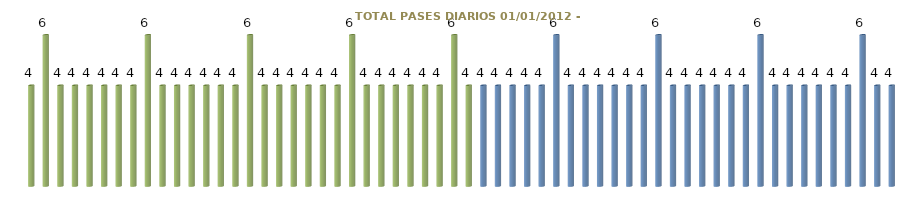
| Category | TOTAL PASES |
|---|---|
| 0 | 4 |
| 1 | 6 |
| 2 | 4 |
| 3 | 4 |
| 4 | 4 |
| 5 | 4 |
| 6 | 4 |
| 7 | 4 |
| 8 | 6 |
| 9 | 4 |
| 10 | 4 |
| 11 | 4 |
| 12 | 4 |
| 13 | 4 |
| 14 | 4 |
| 15 | 6 |
| 16 | 4 |
| 17 | 4 |
| 18 | 4 |
| 19 | 4 |
| 20 | 4 |
| 21 | 4 |
| 22 | 6 |
| 23 | 4 |
| 24 | 4 |
| 25 | 4 |
| 26 | 4 |
| 27 | 4 |
| 28 | 4 |
| 29 | 6 |
| 30 | 4 |
| 31 | 4 |
| 32 | 4 |
| 33 | 4 |
| 34 | 4 |
| 35 | 4 |
| 36 | 6 |
| 37 | 4 |
| 38 | 4 |
| 39 | 4 |
| 40 | 4 |
| 41 | 4 |
| 42 | 4 |
| 43 | 6 |
| 44 | 4 |
| 45 | 4 |
| 46 | 4 |
| 47 | 4 |
| 48 | 4 |
| 49 | 4 |
| 50 | 6 |
| 51 | 4 |
| 52 | 4 |
| 53 | 4 |
| 54 | 4 |
| 55 | 4 |
| 56 | 4 |
| 57 | 6 |
| 58 | 4 |
| 59 | 4 |